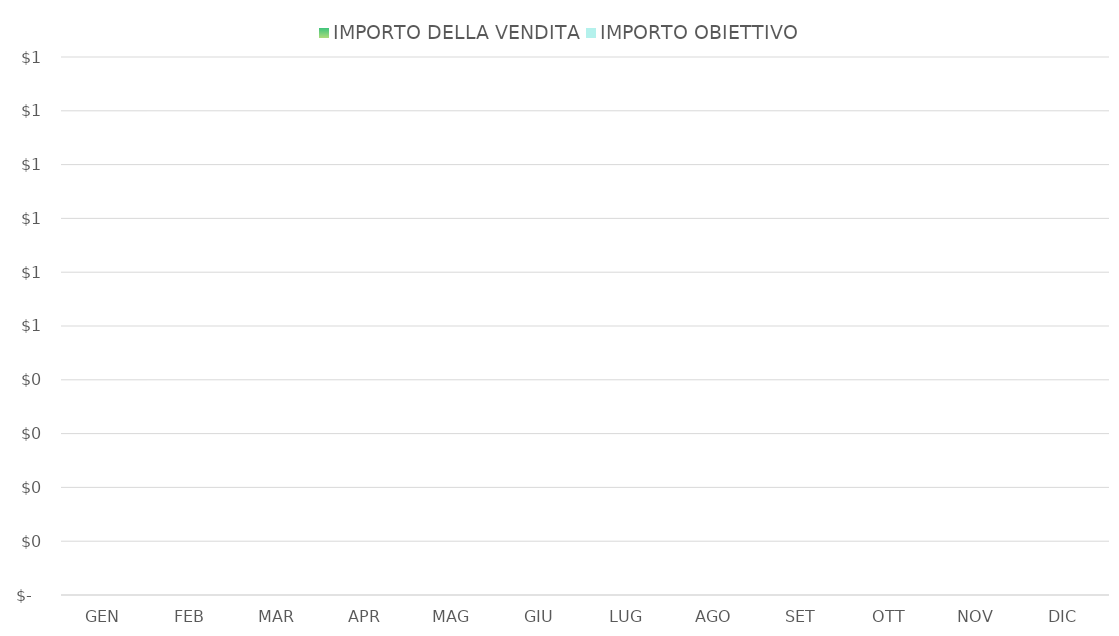
| Category | IMPORTO DELLA VENDITA | IMPORTO OBIETTIVO |
|---|---|---|
| GEN | 0 | 0 |
| FEB | 0 | 0 |
| MAR | 0 | 0 |
| APR | 0 | 0 |
| MAG | 0 | 0 |
| GIU | 0 | 0 |
| LUG | 0 | 0 |
| AGO | 0 | 0 |
| SET | 0 | 0 |
| OTT | 0 | 0 |
| NOV | 0 | 0 |
| DIC | 0 | 0 |